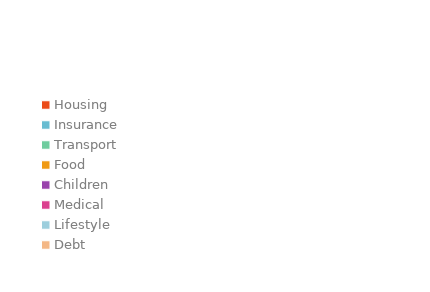
| Category | Series 0 |
|---|---|
| Housing | 0 |
| Insurance | 0 |
| Transport | 0 |
| Food | 0 |
| Children | 0 |
| Medical | 0 |
| Lifestyle | 0 |
| Debt | 0 |